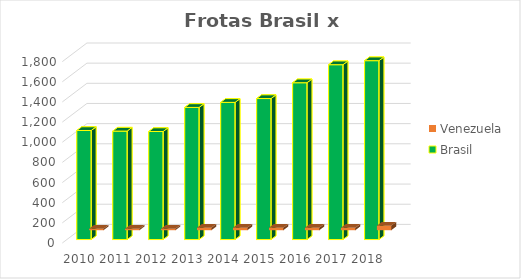
| Category | Venezuela | Brasil |
|---|---|---|
| 2010.0 | 15 | 1082 |
| 2011.0 | 15 | 1076 |
| 2012.0 | 15 | 1072 |
| 2013.0 | 25 | 1311 |
| 2014.0 | 25 | 1361 |
| 2015.0 | 25 | 1399 |
| 2016.0 | 25 | 1556 |
| 2017.0 | 24 | 1735 |
| 2018.0 | 45 | 1775 |